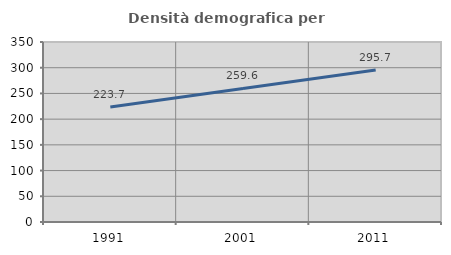
| Category | Densità demografica |
|---|---|
| 1991.0 | 223.743 |
| 2001.0 | 259.616 |
| 2011.0 | 295.725 |